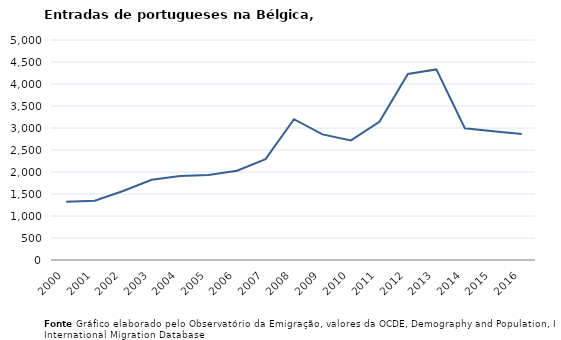
| Category | Entradas |
|---|---|
| 2000.0 | 1324 |
| 2001.0 | 1347 |
| 2002.0 | 1567 |
| 2003.0 | 1823 |
| 2004.0 | 1907 |
| 2005.0 | 1934 |
| 2006.0 | 2030 |
| 2007.0 | 2293 |
| 2008.0 | 3200 |
| 2009.0 | 2854 |
| 2010.0 | 2717 |
| 2011.0 | 3140 |
| 2012.0 | 4228 |
| 2013.0 | 4332 |
| 2014.0 | 2993 |
| 2015.0 | 2927 |
| 2016.0 | 2863 |